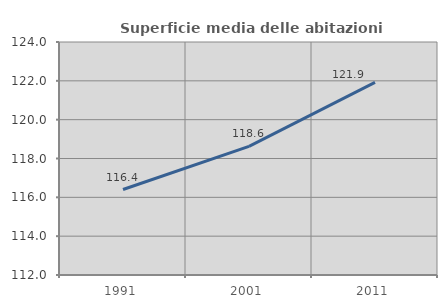
| Category | Superficie media delle abitazioni occupate |
|---|---|
| 1991.0 | 116.402 |
| 2001.0 | 118.627 |
| 2011.0 | 121.921 |